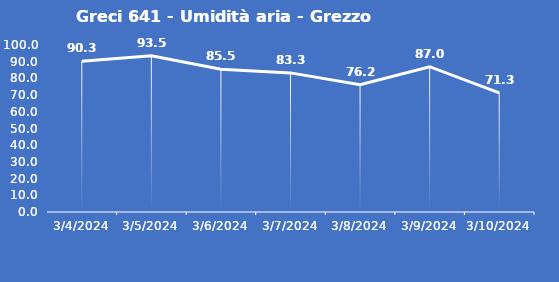
| Category | Greci 641 - Umidità aria - Grezzo (%) |
|---|---|
| 3/4/24 | 90.3 |
| 3/5/24 | 93.5 |
| 3/6/24 | 85.5 |
| 3/7/24 | 83.3 |
| 3/8/24 | 76.2 |
| 3/9/24 | 87 |
| 3/10/24 | 71.3 |